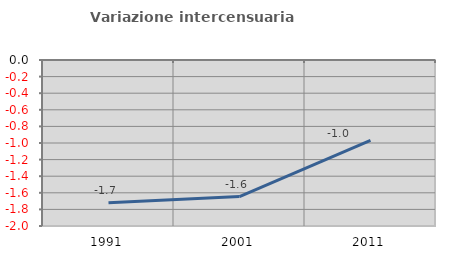
| Category | Variazione intercensuaria annua |
|---|---|
| 1991.0 | -1.719 |
| 2001.0 | -1.645 |
| 2011.0 | -0.968 |